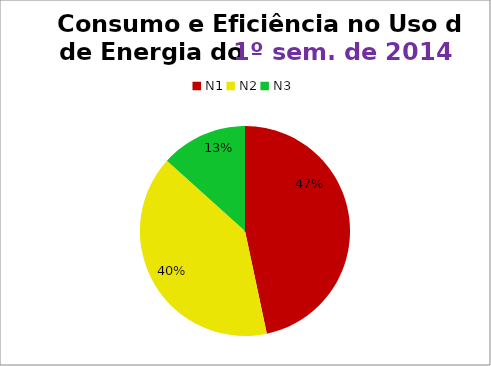
| Category | 1º/14 |
|---|---|
| N1 | 14 |
| N2 | 12 |
| N3 | 4 |